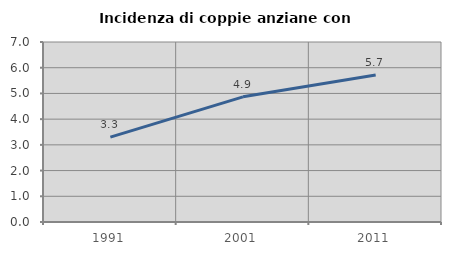
| Category | Incidenza di coppie anziane con figli |
|---|---|
| 1991.0 | 3.299 |
| 2001.0 | 4.868 |
| 2011.0 | 5.717 |